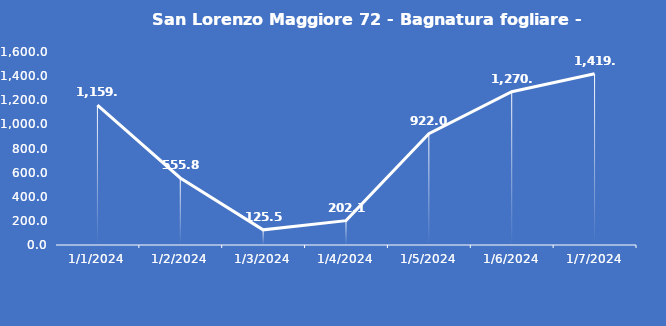
| Category | San Lorenzo Maggiore 72 - Bagnatura fogliare - Grezzo (min) |
|---|---|
| 1/1/24 | 1159.1 |
| 1/2/24 | 555.8 |
| 1/3/24 | 125.5 |
| 1/4/24 | 202.1 |
| 1/5/24 | 922 |
| 1/6/24 | 1270.4 |
| 1/7/24 | 1419.5 |